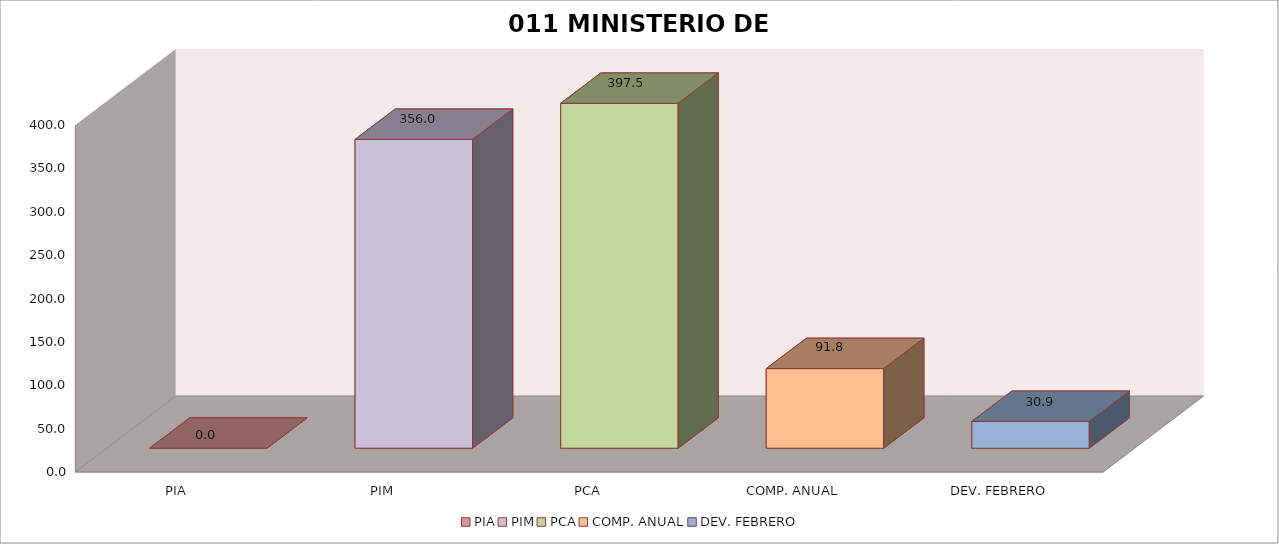
| Category | 011 MINISTERIO DE SALUD |
|---|---|
| PIA | 0 |
| PIM | 356.006 |
| PCA | 397.545 |
| COMP. ANUAL | 91.784 |
| DEV. FEBRERO | 30.859 |